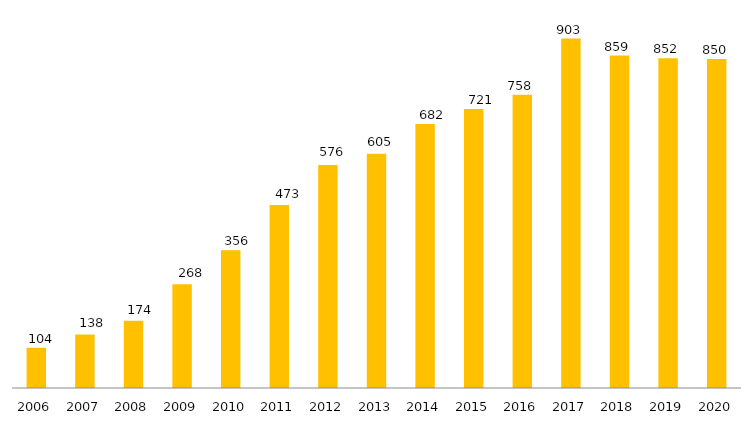
| Category | Programa |
|---|---|
| 2006.0 | 104 |
| 2007.0 | 138 |
| 2008.0 | 174 |
| 2009.0 | 268 |
| 2010.0 | 356 |
| 2011.0 | 473 |
| 2012.0 | 576 |
| 2013.0 | 605 |
| 2014.0 | 682 |
| 2015.0 | 721 |
| 2016.0 | 758 |
| 2017.0 | 903 |
| 2018.0 | 859 |
| 2019.0 | 852 |
| 2020.0 | 850 |